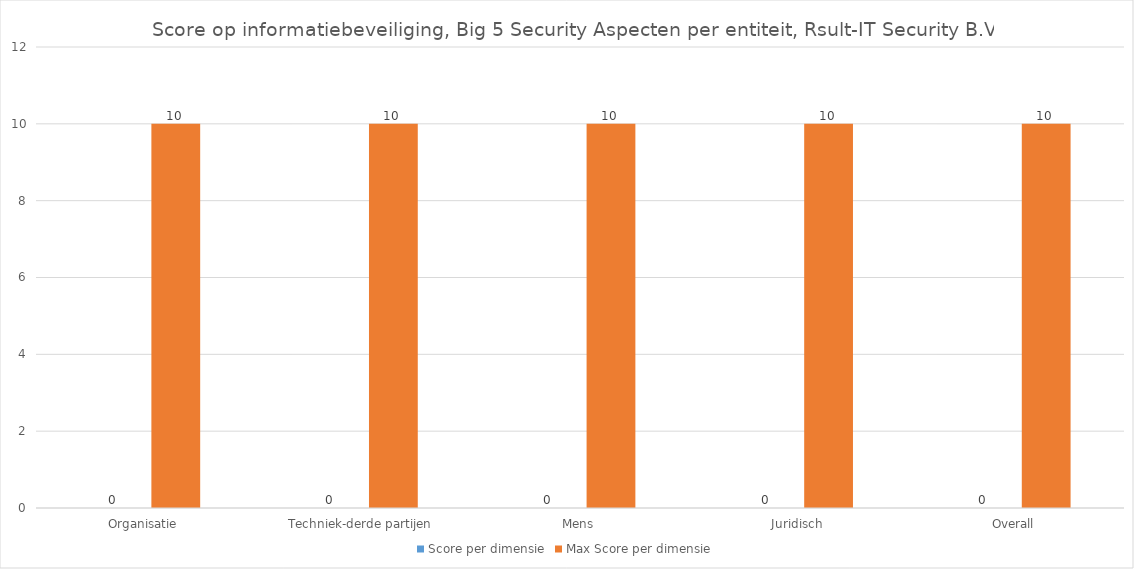
| Category | Score per dimensie | Max Score per dimensie |
|---|---|---|
| Organisatie | 0 | 10 |
| Techniek-derde partijen | 0 | 10 |
| Mens | 0 | 10 |
| Juridisch | 0 | 10 |
| Overall | 0 | 10 |